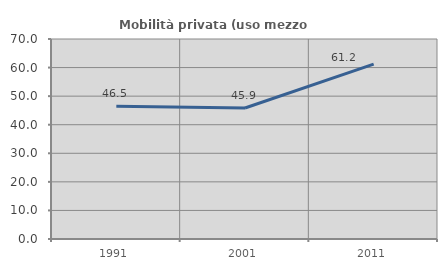
| Category | Mobilità privata (uso mezzo privato) |
|---|---|
| 1991.0 | 46.486 |
| 2001.0 | 45.854 |
| 2011.0 | 61.207 |